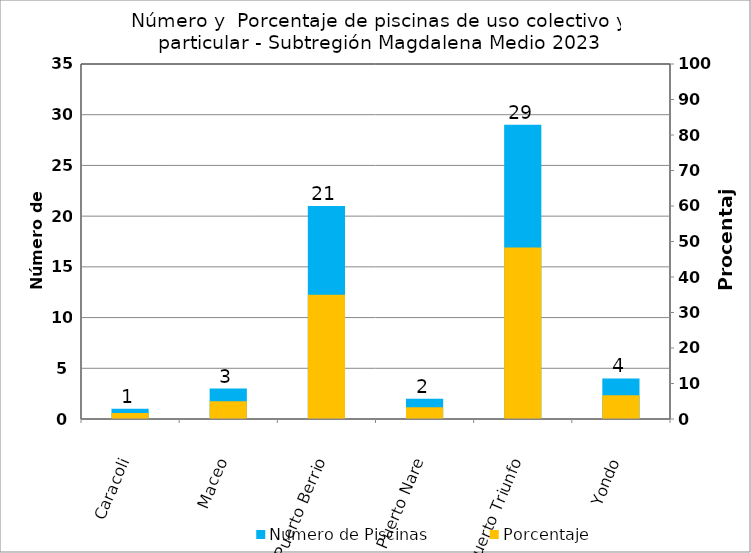
| Category | Numero de Piscinas |
|---|---|
| Caracoli | 1 |
| Maceo | 3 |
| Puerto Berrio | 21 |
| Puerto Nare | 2 |
| Puerto Triunfo | 29 |
| Yondo | 4 |